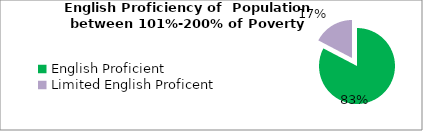
| Category | Percent |
|---|---|
| English Proficient | 0.827 |
| Limited English Proficent | 0.173 |